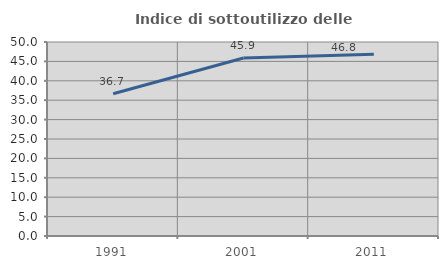
| Category | Indice di sottoutilizzo delle abitazioni  |
|---|---|
| 1991.0 | 36.65 |
| 2001.0 | 45.86 |
| 2011.0 | 46.848 |